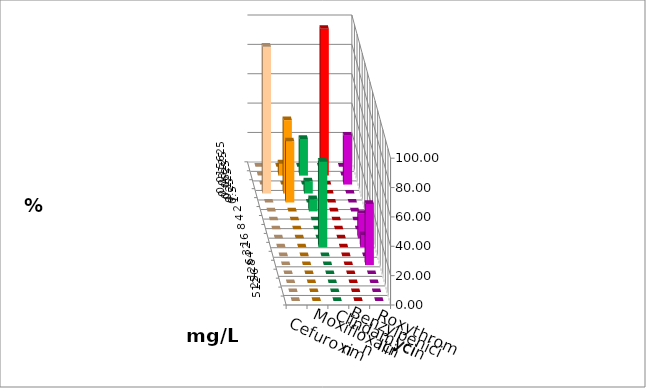
| Category | Cefuroxim | Moxifloxacin | Clindamycin | Benzylpenicillin | Roxythromycin |
|---|---|---|---|---|---|
| 0.015625 | 0 | 0 | 0 | 0 | 0 |
| 0.03125 | 0 | 8.333 | 25 | 100 | 0 |
| 0.0625 | 0 | 0 | 0 | 0 | 33.333 |
| 0.125 | 100 | 50 | 8.333 | 0 | 0 |
| 0.25 | 0 | 41.667 | 0 | 0 | 0 |
| 0.5 | 0 | 0 | 8.333 | 0 | 0 |
| 1.0 | 0 | 0 | 0 | 0 | 0 |
| 2.0 | 0 | 0 | 0 | 0 | 0 |
| 4.0 | 0 | 0 | 0 | 0 | 16.667 |
| 8.0 | 0 | 0 | 58.333 | 0 | 8.333 |
| 16.0 | 0 | 0 | 0 | 0 | 0 |
| 32.0 | 0 | 0 | 0 | 0 | 41.667 |
| 64.0 | 0 | 0 | 0 | 0 | 0 |
| 128.0 | 0 | 0 | 0 | 0 | 0 |
| 256.0 | 0 | 0 | 0 | 0 | 0 |
| 512.0 | 0 | 0 | 0 | 0 | 0 |